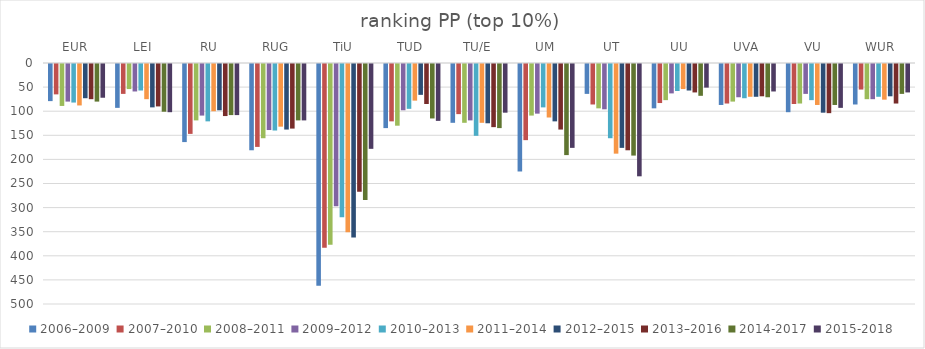
| Category | 2006–2009 | 2007–2010 | 2008–2011 | 2009–2012 | 2010–2013 | 2011–2014 | 2012–2015 | 2013–2016 | 2014-2017 | 2015-2018 |
|---|---|---|---|---|---|---|---|---|---|---|
| EUR | 77 | 63 | 87 | 78 | 80 | 86 | 71 | 73 | 78 | 70 |
| LEI | 91 | 62 | 52 | 57 | 55 | 73 | 90 | 88 | 99 | 100 |
| RU | 162 | 145 | 117 | 107 | 119 | 98 | 96 | 108 | 106 | 106 |
| RUG | 179 | 172 | 154 | 137 | 138 | 130 | 136 | 134 | 117 | 117 |
| TiU | 460 | 381 | 375 | 295 | 318 | 349 | 360 | 265 | 282 | 176 |
| TUD | 133 | 119 | 128 | 96 | 93 | 76 | 64 | 83 | 113 | 118 |
| TU/E | 122 | 104 | 122 | 117 | 149 | 122 | 123 | 131 | 133 | 101 |
| UM | 223 | 158 | 107 | 103 | 90 | 111 | 119 | 136 | 189 | 174 |
| UT | 62 | 84 | 92 | 94 | 154 | 186 | 174 | 179 | 190 | 233 |
| UU | 92 | 81 | 75 | 61 | 56 | 52 | 55 | 59 | 66 | 49 |
| UVA | 85 | 82 | 78 | 69 | 71 | 68 | 68 | 67 | 69 | 57 |
| VU | 100 | 83 | 82 | 62 | 75 | 85 | 101 | 102 | 85 | 91 |
| WUR | 84 | 53 | 73 | 73 | 68 | 74 | 67 | 82 | 62 | 59 |